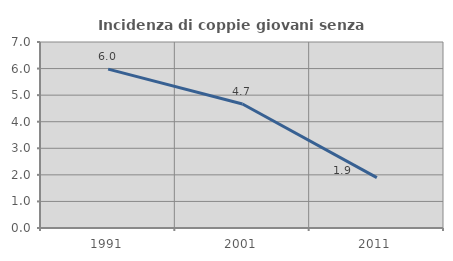
| Category | Incidenza di coppie giovani senza figli |
|---|---|
| 1991.0 | 5.98 |
| 2001.0 | 4.668 |
| 2011.0 | 1.894 |